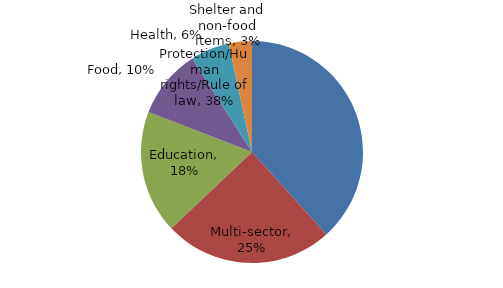
| Category | Series 0 |
|---|---|
| Protection/Human rights/Rule of law | 0.383 |
| Multi-sector | 0.246 |
| Education | 0.179 |
| Food | 0.101 |
| Health | 0.057 |
| Shelter and non-food items | 0.034 |